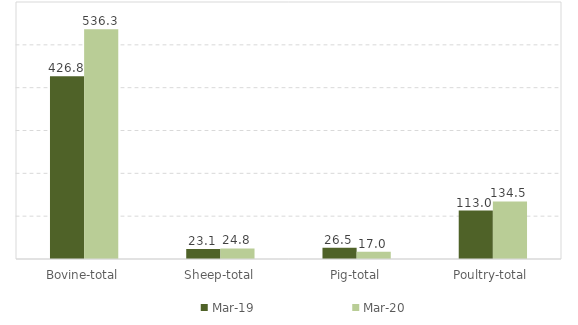
| Category | Mar-19 | Mar-20 |
|---|---|---|
| Bovine-total | 426.8 | 536.3 |
| Sheep-total | 23.1 | 24.8 |
| Pig-total | 26.5 | 17 |
| Poultry-total | 113 | 134.5 |